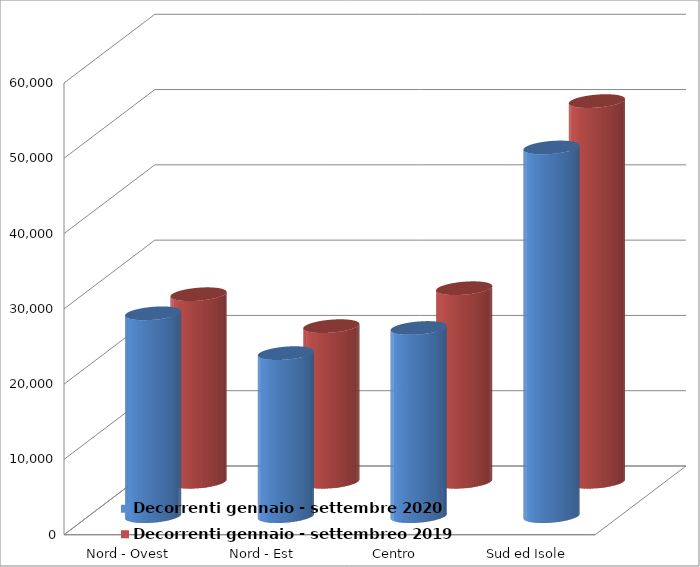
| Category | Decorrenti gennaio - settembre 2020 | Decorrenti gennaio - settembreo 2019 |
|---|---|---|
| Nord - Ovest | 26943 | 24917 |
| Nord - Est | 21655 | 20674 |
| Centro | 24996 | 25714 |
| Sud ed Isole | 48972 | 50566 |